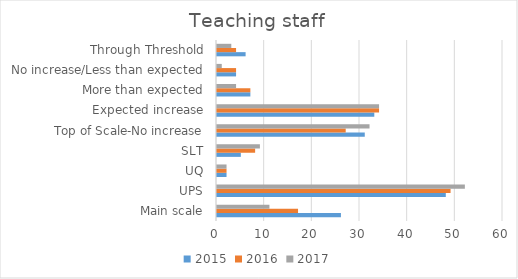
| Category | 2015 | 2016 | 2017 |
|---|---|---|---|
| Main scale | 26 | 17 | 11 |
| UPS | 48 | 49 | 52 |
| UQ | 2 | 2 | 2 |
| SLT | 5 | 8 | 9 |
| Top of Scale-No increase | 31 | 27 | 32 |
| Expected increase | 33 | 34 | 34 |
| More than expected | 7 | 7 | 4 |
| No increase/Less than expected | 4 | 4 | 1 |
| Through Threshold | 6 | 4 | 3 |